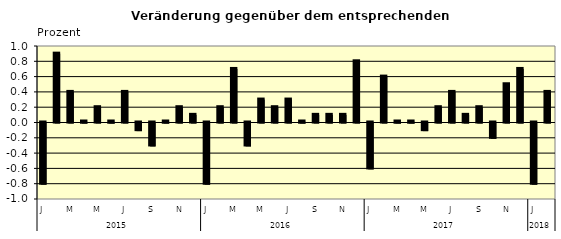
| Category | Series 0 |
|---|---|
| 0 | -0.8 |
| 1 | 0.9 |
| 2 | 0.4 |
| 3 | 0.01 |
| 4 | 0.2 |
| 5 | 0.01 |
| 6 | 0.4 |
| 7 | -0.1 |
| 8 | -0.3 |
| 9 | 0.01 |
| 10 | 0.2 |
| 11 | 0.1 |
| 12 | -0.8 |
| 13 | 0.2 |
| 14 | 0.7 |
| 15 | -0.3 |
| 16 | 0.3 |
| 17 | 0.2 |
| 18 | 0.3 |
| 19 | 0.01 |
| 20 | 0.1 |
| 21 | 0.1 |
| 22 | 0.1 |
| 23 | 0.8 |
| 24 | -0.6 |
| 25 | 0.6 |
| 26 | 0.01 |
| 27 | 0.01 |
| 28 | -0.1 |
| 29 | 0.2 |
| 30 | 0.4 |
| 31 | 0.1 |
| 32 | 0.2 |
| 33 | -0.2 |
| 34 | 0.5 |
| 35 | 0.7 |
| 36 | -0.8 |
| 37 | 0.4 |